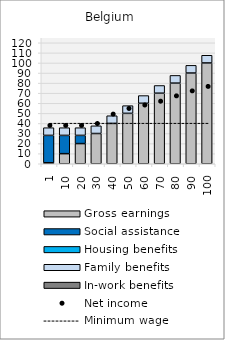
| Category | Gross earnings | Social assistance | Housing benefits | Family benefits | In-work benefits |
|---|---|---|---|---|---|
| 1.0 | 1 | 27.137 | 0 | 7.638 | 0 |
| 10.0 | 10 | 18.137 | 0 | 7.638 | 0 |
| 20.0 | 20 | 8.137 | 0 | 7.638 | 0 |
| 30.0 | 30.001 | 0 | 0 | 7.638 | 0 |
| 40.0 | 40.001 | 0 | 0 | 7.638 | 0 |
| 50.0 | 50.001 | 0 | 0 | 7.638 | 0 |
| 60.0 | 59.999 | 0 | 0 | 7.638 | 0 |
| 70.0 | 69.999 | 0 | 0 | 7.638 | 0 |
| 80.0 | 80 | 0 | 0 | 7.638 | 0 |
| 90.0 | 90 | 0 | 0 | 7.638 | 0 |
| 100.0 | 100 | 0 | 0 | 7.638 | 0 |